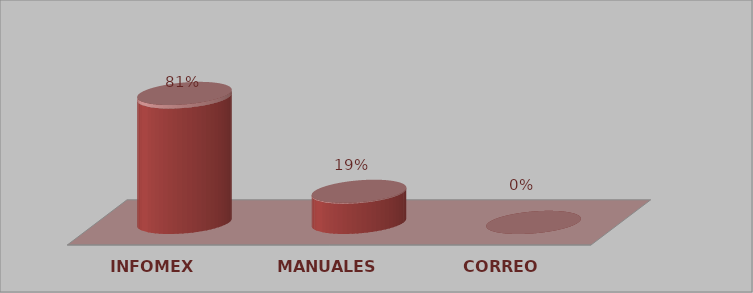
| Category | Series 0 | Series 1 |
|---|---|---|
| INFOMEX | 29 | 0.806 |
| MANUALES | 7 | 0.194 |
| CORREO | 0 | 0 |